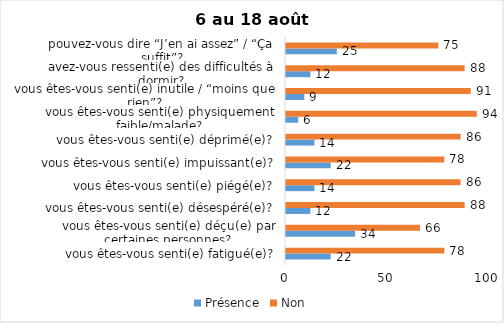
| Category | Présence | Non |
|---|---|---|
| vous êtes-vous senti(e) fatigué(e)? | 22 | 78 |
| vous êtes-vous senti(e) déçu(e) par certaines personnes? | 34 | 66 |
| vous êtes-vous senti(e) désespéré(e)? | 12 | 88 |
| vous êtes-vous senti(e) piégé(e)? | 14 | 86 |
| vous êtes-vous senti(e) impuissant(e)? | 22 | 78 |
| vous êtes-vous senti(e) déprimé(e)? | 14 | 86 |
| vous êtes-vous senti(e) physiquement faible/malade? | 6 | 94 |
| vous êtes-vous senti(e) inutile / “moins que rien”? | 9 | 91 |
| avez-vous ressenti(e) des difficultés à dormir? | 12 | 88 |
| pouvez-vous dire “J’en ai assez” / “Ça suffit”? | 25 | 75 |